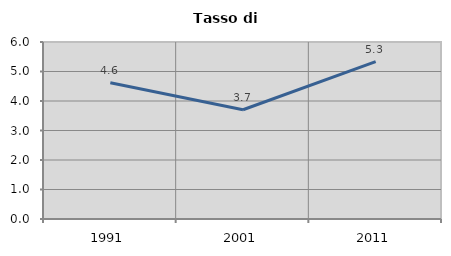
| Category | Tasso di disoccupazione   |
|---|---|
| 1991.0 | 4.622 |
| 2001.0 | 3.702 |
| 2011.0 | 5.332 |